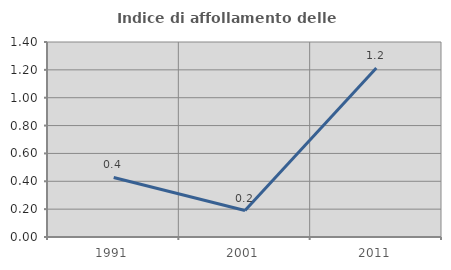
| Category | Indice di affollamento delle abitazioni  |
|---|---|
| 1991.0 | 0.427 |
| 2001.0 | 0.19 |
| 2011.0 | 1.213 |